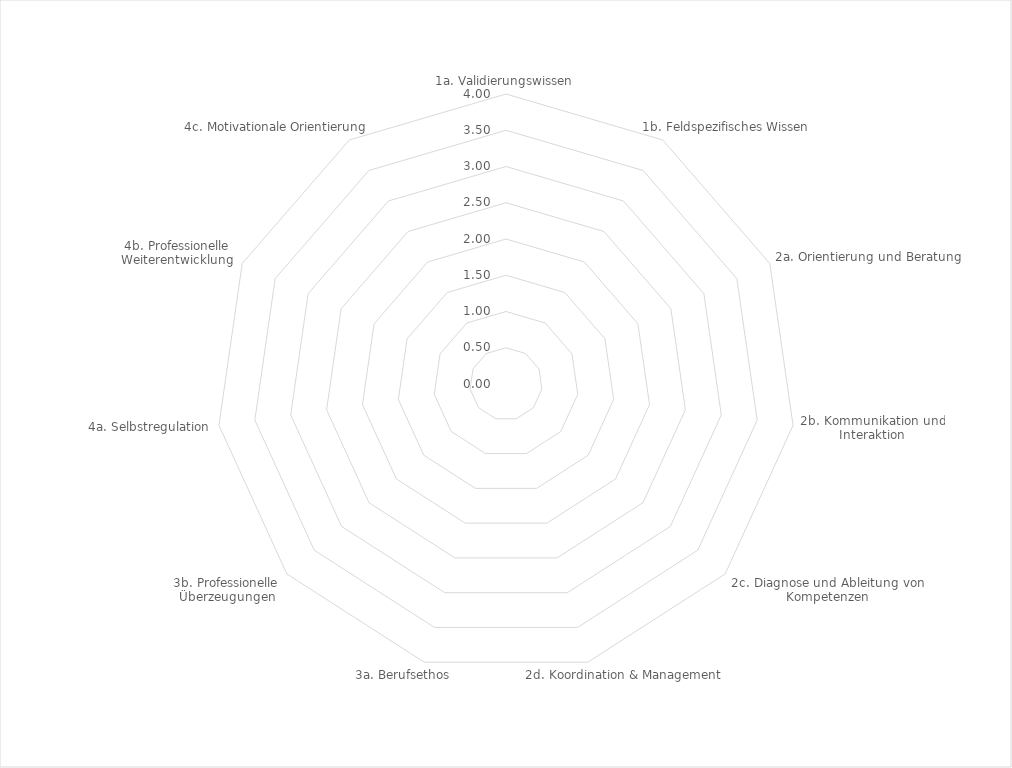
| Category | Series 0 |
|---|---|
| 1a. Validierungswissen | 0 |
| 1b. Feldspezifisches Wissen | 0 |
| 2a. Orientierung und Beratung | 0 |
| 2b. Kommunikation und Interaktion | 0 |
| 2c. Diagnose und Ableitung von Kompetenzen | 0 |
| 2d. Koordination & Management | 0 |
| 3a. Berufsethos | 0 |
| 3b. Professionelle Überzeugungen | 0 |
| 4a. Selbstregulation | 0 |
| 4b. Professionelle Weiterentwicklung | 0 |
| 4c. Motivationale Orientierung | 0 |